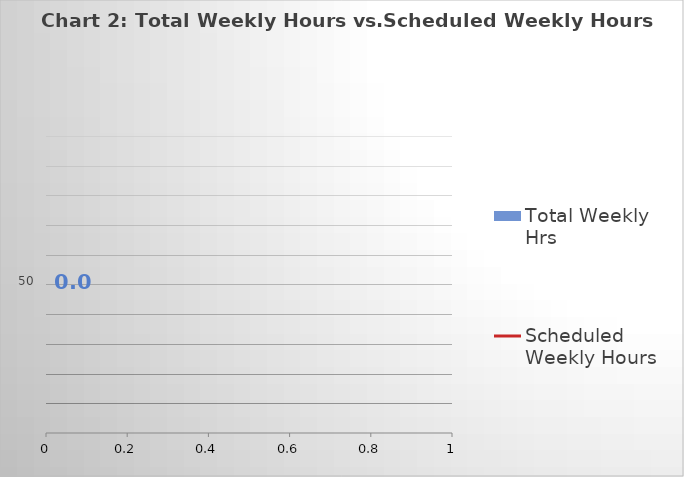
| Category | Total Weekly Hrs |
|---|---|
| 0 | 0 |